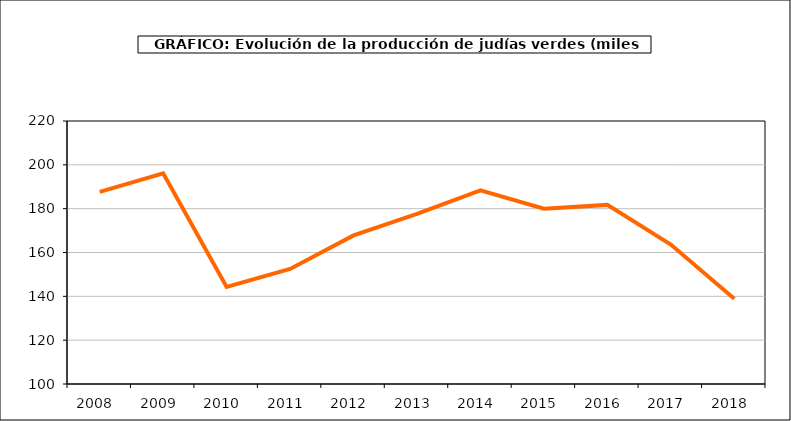
| Category | producción |
|---|---|
| 2008.0 | 187.672 |
| 2009.0 | 196.109 |
| 2010.0 | 144.301 |
| 2011.0 | 152.507 |
| 2012.0 | 167.816 |
| 2013.0 | 177.588 |
| 2014.0 | 188.38 |
| 2015.0 | 179.947 |
| 2016.0 | 181.725 |
| 2017.0 | 163.649 |
| 2018.0 | 138.925 |